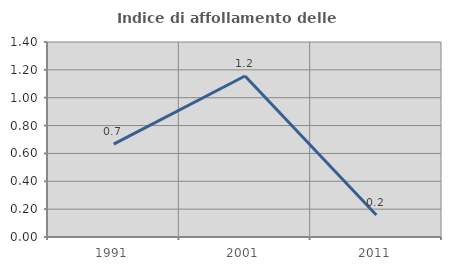
| Category | Indice di affollamento delle abitazioni  |
|---|---|
| 1991.0 | 0.667 |
| 2001.0 | 1.156 |
| 2011.0 | 0.158 |